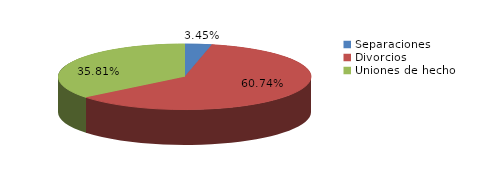
| Category | Series 0 |
|---|---|
| Separaciones | 13 |
| Divorcios | 229 |
| Uniones de hecho | 135 |